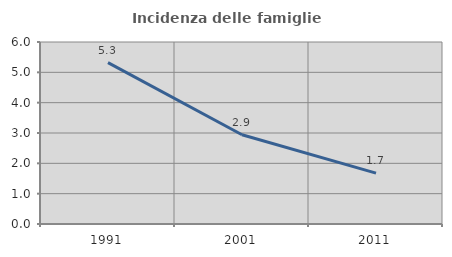
| Category | Incidenza delle famiglie numerose |
|---|---|
| 1991.0 | 5.321 |
| 2001.0 | 2.942 |
| 2011.0 | 1.678 |